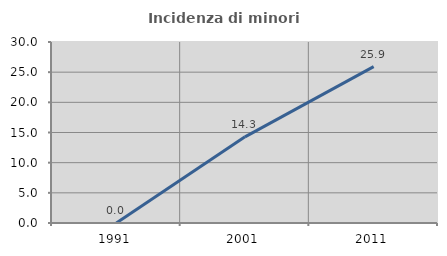
| Category | Incidenza di minori stranieri |
|---|---|
| 1991.0 | 0 |
| 2001.0 | 14.286 |
| 2011.0 | 25.926 |